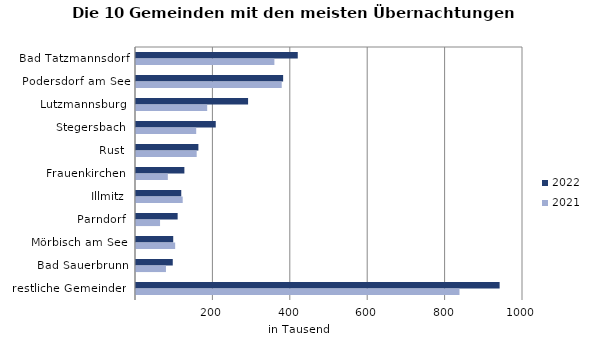
| Category | 2022 | 2021 |
|---|---|---|
| Bad Tatzmannsdorf | 417994 | 357588 |
| Podersdorf am See | 380185 | 376545 |
| Lutzmannsburg | 289608 | 183966 |
| Stegersbach | 206066 | 155545 |
| Rust | 161211 | 156844 |
| Frauenkirchen | 125028 | 82239 |
| Illmitz | 116953 | 120694 |
| Parndorf | 107616 | 62144 |
| Mörbisch am See | 96183 | 101217 |
| Bad Sauerbrunn | 95003 | 77382 |
| restliche Gemeinden | 939606 | 835897 |